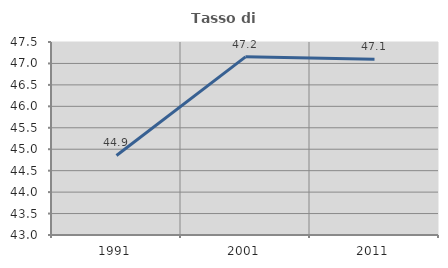
| Category | Tasso di occupazione   |
|---|---|
| 1991.0 | 44.855 |
| 2001.0 | 47.154 |
| 2011.0 | 47.1 |